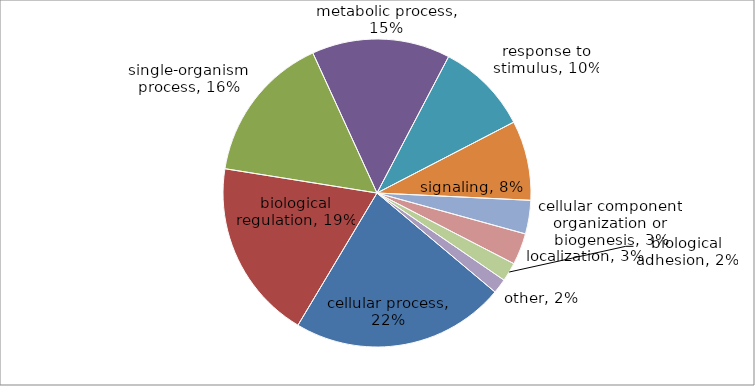
| Category | Series 0 |
|---|---|
| cellular process | 102 |
| biological regulation | 86 |
| single-organism process | 71 |
| metabolic process | 66 |
| response to stimulus | 44 |
| signaling | 38 |
| cellular component organization or biogenesis | 16 |
| localization | 15 |
| biological adhesion | 9 |
| other | 7 |